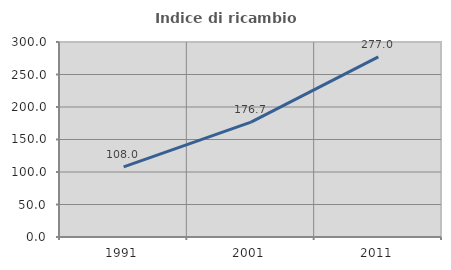
| Category | Indice di ricambio occupazionale  |
|---|---|
| 1991.0 | 108 |
| 2001.0 | 176.712 |
| 2011.0 | 277.049 |